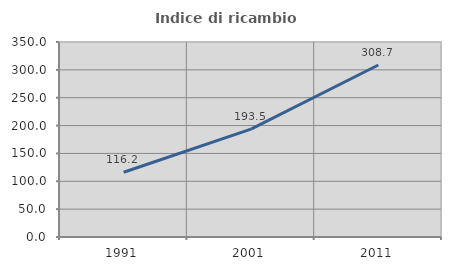
| Category | Indice di ricambio occupazionale  |
|---|---|
| 1991.0 | 116.226 |
| 2001.0 | 193.491 |
| 2011.0 | 308.667 |